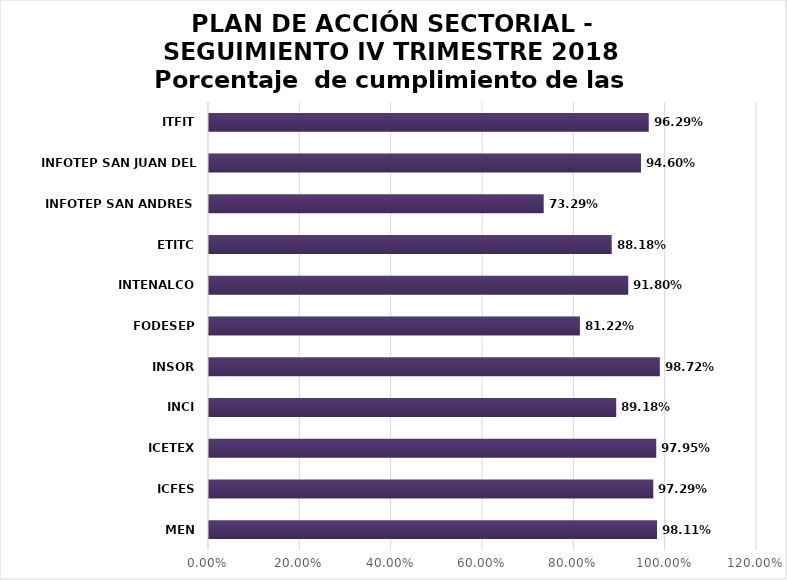
| Category | Talento Humano | Direccionamiento Estratégico | Valores para resultados | Evaluación de resultados | Información y Comunicación | Gestión del Conocimiento | Control Interno | Promedio  de cumplimiento de las Entidades |
|---|---|---|---|---|---|---|---|---|
| MEN |  |  |  |  |  |  |  | 0.981 |
| ICFES |  |  |  |  |  |  |  | 0.973 |
| ICETEX |  |  |  |  |  |  |  | 0.979 |
| INCI |  |  |  |  |  |  |  | 0.892 |
| INSOR |  |  |  |  |  |  |  | 0.987 |
| FODESEP |  |  |  |  |  |  |  | 0.812 |
| INTENALCO |  |  |  |  |  |  |  | 0.918 |
| ETITC |  |  |  |  |  |  |  | 0.882 |
| INFOTEP SAN ANDRES |  |  |  |  |  |  |  | 0.733 |
| INFOTEP SAN JUAN DEL CESAR |  |  |  |  |  |  |  | 0.946 |
| ITFIT |  |  |  |  |  |  |  | 0.963 |